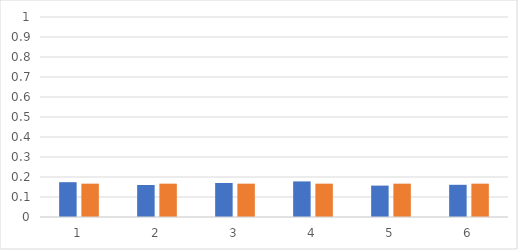
| Category | rel gyak | vsz |
|---|---|---|
| 0 | 0.174 | 0.167 |
| 1 | 0.16 | 0.167 |
| 2 | 0.17 | 0.167 |
| 3 | 0.178 | 0.167 |
| 4 | 0.157 | 0.167 |
| 5 | 0.161 | 0.167 |